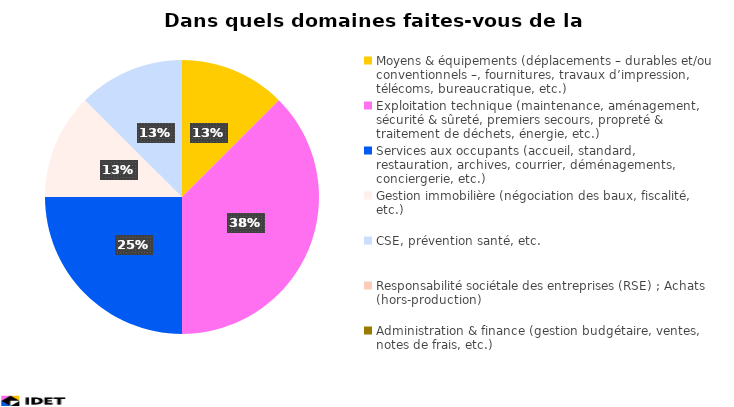
| Category | Series 1 |
|---|---|
| Moyens & équipements (déplacements – durables et/ou conventionnels –, fournitures, travaux d’impression, télécoms, bureaucratique, etc.) | 1 |
| Exploitation technique (maintenance, aménagement, sécurité & sûreté, premiers secours, propreté & traitement de déchets, énergie, etc.) | 3 |
| Services aux occupants (accueil, standard, restauration, archives, courrier, déménagements, conciergerie, etc.) | 2 |
| Gestion immobilière (négociation des baux, fiscalité, etc.) | 1 |
| CSE, prévention santé, etc. | 1 |
| Responsabilité sociétale des entreprises (RSE) ; Achats (hors-production) | 0 |
| Administration & finance (gestion budgétaire, ventes, notes de frais, etc.) | 0 |